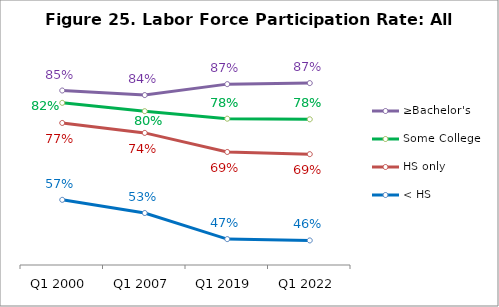
| Category | ≥Bachelor's | Some College | HS only | < HS |
|---|---|---|---|---|
| Q1 2000 | 0.851 | 0.819 | 0.767 | 0.569 |
| Q1 2007 | 0.839 | 0.798 | 0.742 | 0.534 |
| Q1 2019 | 0.868 | 0.778 | 0.692 | 0.467 |
| Q1 2022 | 0.87 | 0.777 | 0.687 | 0.464 |